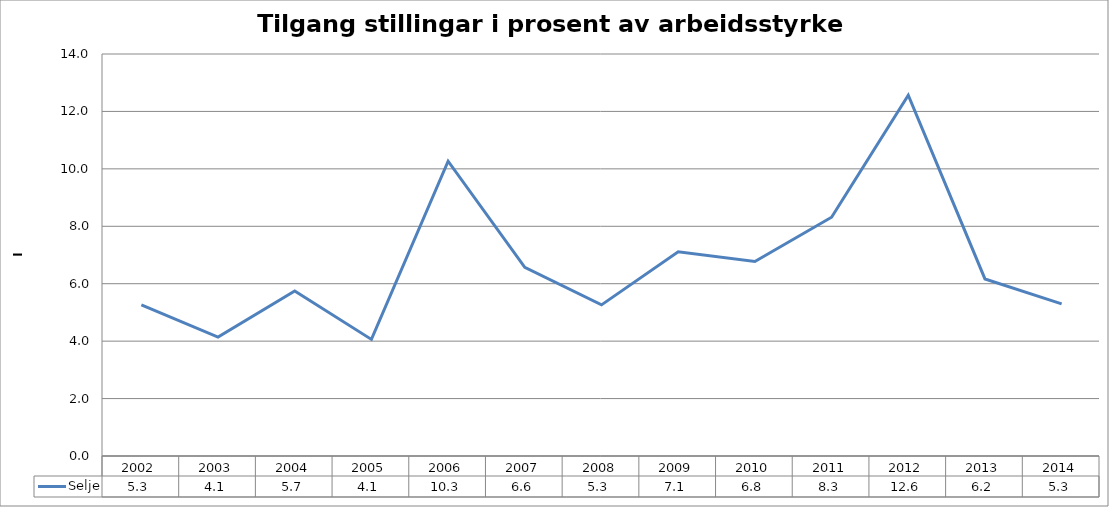
| Category | Selje |
|---|---|
| 2002.0 | 5.263 |
| 2003.0 | 4.142 |
| 2004.0 | 5.749 |
| 2005.0 | 4.061 |
| 2006.0 | 10.265 |
| 2007.0 | 6.567 |
| 2008.0 | 5.263 |
| 2009.0 | 7.113 |
| 2010.0 | 6.771 |
| 2011.0 | 8.315 |
| 2012.0 | 12.563 |
| 2013.0 | 6.166 |
| 2014.0 | 5.3 |